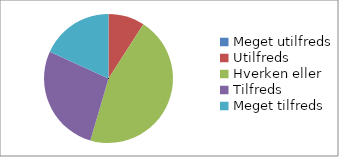
| Category | Hvor tilfreds er du med workshoppen 'Experts in Teams'? (n=11) |
|---|---|
| Meget utilfreds | 0 |
| Utilfreds | 0.091 |
| Hverken eller | 0.455 |
| Tilfreds | 0.273 |
| Meget tilfreds | 0.182 |